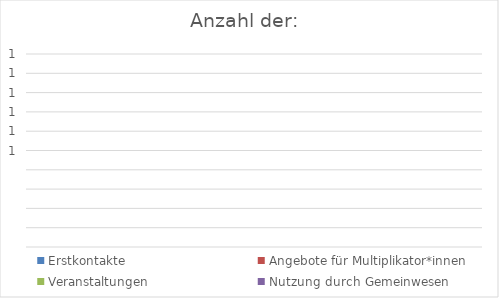
| Category | Erstkontakte | Angebote für Multiplikator*innen | Veranstaltungen | Nutzung durch Gemeinwesen |
|---|---|---|---|---|
| 0 | 0 | 0 | 0 | 0 |